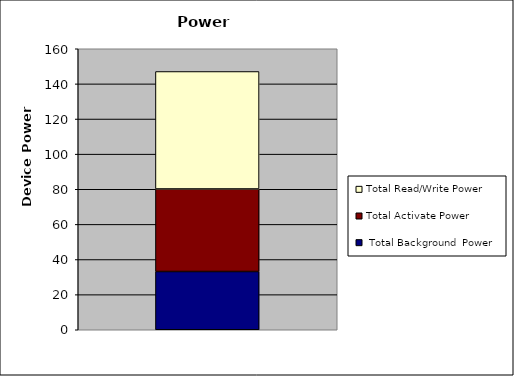
| Category |  Total Background  Power | Total Activate Power | Total Read/Write Power |
|---|---|---|---|
| 0 | 33.168 | 47 | 66.884 |